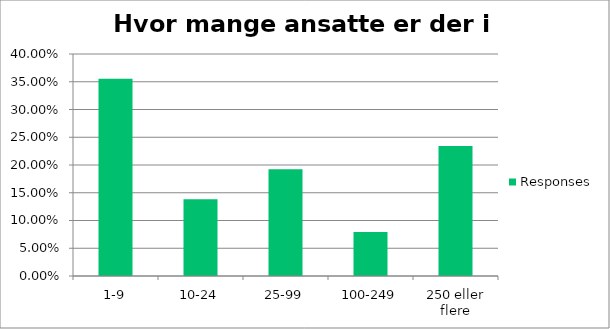
| Category | Responses |
|---|---|
| 1-9 | 0.356 |
| 10-24 | 0.138 |
| 25-99 | 0.192 |
| 100-249 | 0.08 |
| 250 eller flere | 0.234 |